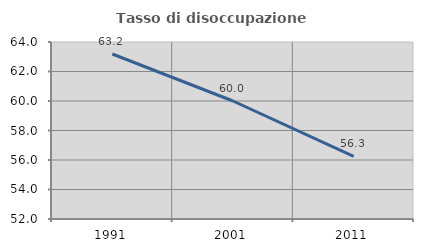
| Category | Tasso di disoccupazione giovanile  |
|---|---|
| 1991.0 | 63.187 |
| 2001.0 | 60 |
| 2011.0 | 56.25 |